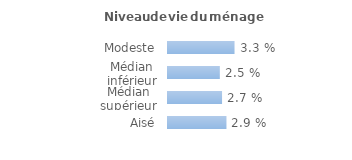
| Category | Series 0 |
|---|---|
| Modeste | 0.033 |
| Médian inférieur | 0.025 |
| Médian supérieur | 0.027 |
| Aisé | 0.029 |